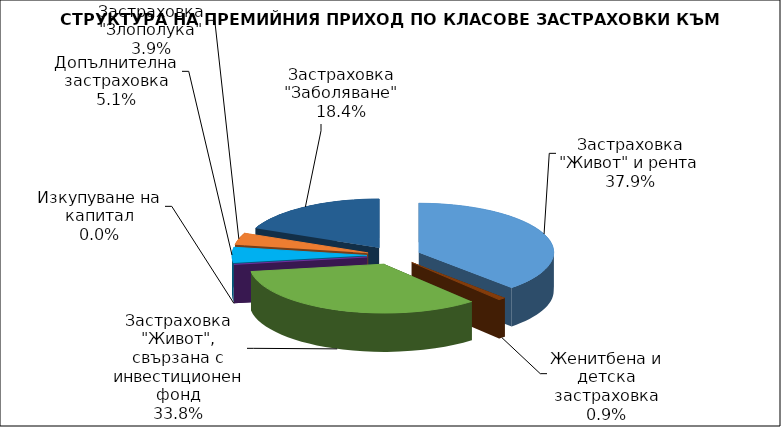
| Category | Застраховка "Живот" и рента |
|---|---|
| Застраховка "Живот" и рента | 44802586.721 |
| Женитбена и детска застраховка | 1056292.052 |
| Застраховка "Живот", свързана с инвестиционен фонд | 39901172.364 |
| Изкупуване на капитал | 0 |
| Допълнителна застраховка | 6052483.58 |
| Застраховка "Злополука" | 4620203.477 |
| Застраховка "Заболяване" | 21749317.187 |